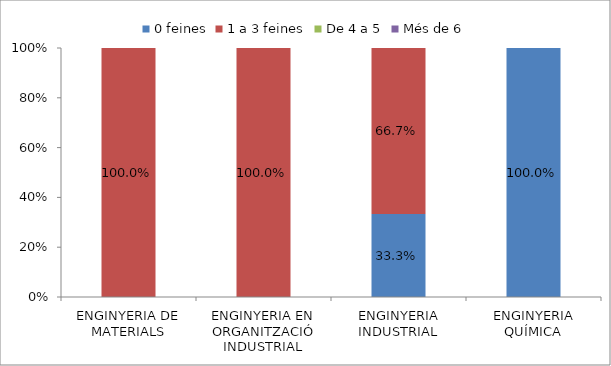
| Category | 0 feines | 1 a 3 feines | De 4 a 5 | Més de 6 |
|---|---|---|---|---|
| ENGINYERIA DE MATERIALS | 0 | 1 | 0 | 0 |
| ENGINYERIA EN ORGANITZACIÓ INDUSTRIAL | 0 | 1 | 0 | 0 |
| ENGINYERIA INDUSTRIAL | 0.333 | 0.667 | 0 | 0 |
| ENGINYERIA QUÍMICA | 1 | 0 | 0 | 0 |